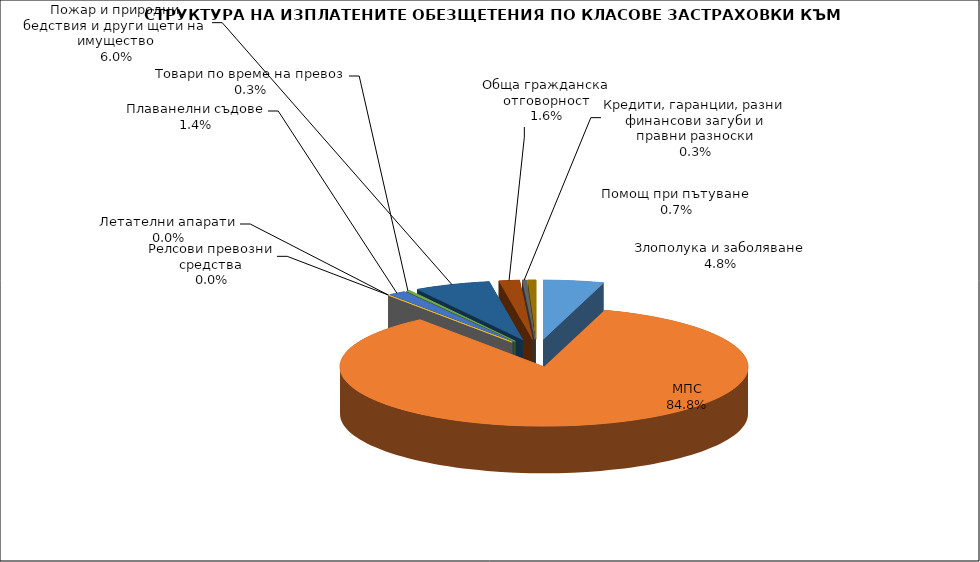
| Category | Series 0 |
|---|---|
| Злополука и заболяване | 0.048 |
| МПС | 0.848 |
| Релсови превозни средства | 0 |
| Летателни апарати | 0 |
| Плаванелни съдове | 0.014 |
| Товари по време на превоз | 0.003 |
| Пожар и природни бедствия и други щети на имущество | 0.06 |
| Обща гражданска отговорност | 0.016 |
| Кредити, гаранции, разни финансови загуби и правни разноски | 0.003 |
| Помощ при пътуване | 0.007 |